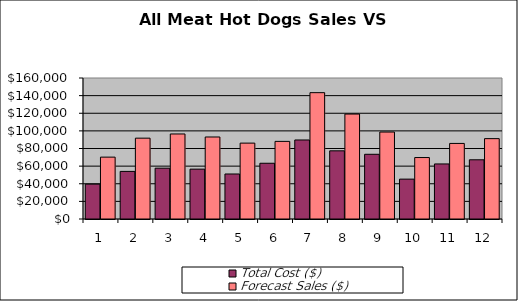
| Category | Total Cost ($) | Forecast Sales ($) |
|---|---|---|
| 0 | 39542.287 | 70200 |
| 1 | 54014.448 | 91728 |
| 2 | 57673.313 | 96480 |
| 3 | 56562.015 | 93060 |
| 4 | 51070.982 | 86112 |
| 5 | 63250.248 | 88075 |
| 6 | 89677.897 | 143365 |
| 7 | 77344.228 | 119080 |
| 8 | 73422.936 | 98685 |
| 9 | 45247.469 | 69750 |
| 10 | 62467.341 | 85750 |
| 11 | 67183.119 | 91200 |